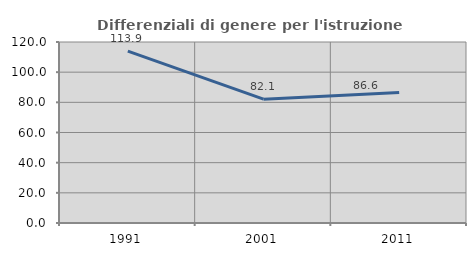
| Category | Differenziali di genere per l'istruzione superiore |
|---|---|
| 1991.0 | 113.941 |
| 2001.0 | 82.11 |
| 2011.0 | 86.556 |